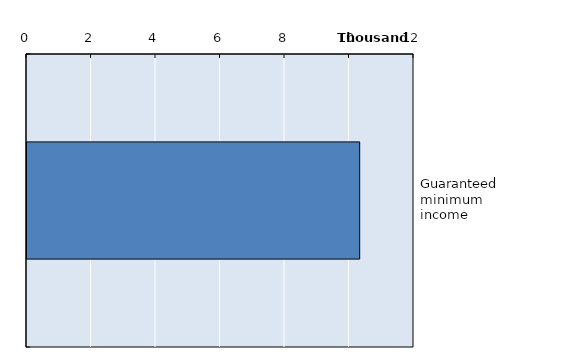
| Category | Series 0 |
|---|---|
| Guaranteed minimum income | 10316 |